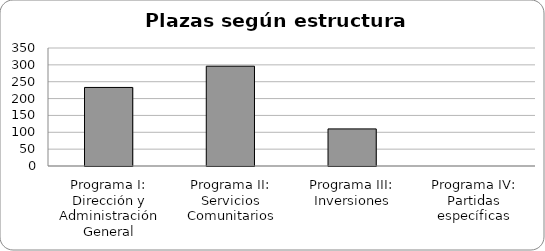
| Category | Series 0 |
|---|---|
| Programa I: Dirección y Administración General | 233 |
| Programa II: Servicios Comunitarios | 296 |
| Programa III: Inversiones | 110 |
| Programa IV: Partidas específicas | 0 |